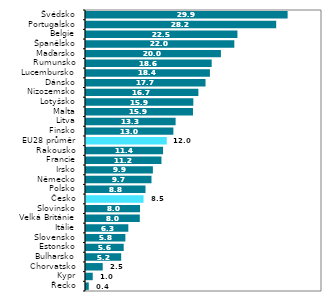
| Category | Series 0 |
|---|---|
| Řecko | 0.413 |
| Kypr | 1 |
| Chorvatsko | 2.478 |
| Bulharsko | 5.218 |
| Estonsko | 5.589 |
| Slovensko | 5.84 |
| Itálie | 6.278 |
| Velká Británie | 7.979 |
| Slovinsko | 8.01 |
| Česko | 8.534 |
| Polsko | 8.823 |
| Německo | 9.712 |
| Irsko | 9.919 |
| Francie | 11.19 |
| Rakousko | 11.429 |
| EU28 průměr | 11.978 |
| Finsko | 12.958 |
| Litva | 13.289 |
| Malta | 15.866 |
| Lotyšsko | 15.917 |
| Nizozemsko | 16.667 |
| Dánsko | 17.727 |
| Lucembursko | 18.379 |
| Rumunsko | 18.641 |
| Maďarsko | 20.007 |
| Španělsko | 21.997 |
| Belgie | 22.458 |
| Portugalsko | 28.208 |
| Švédsko | 29.901 |